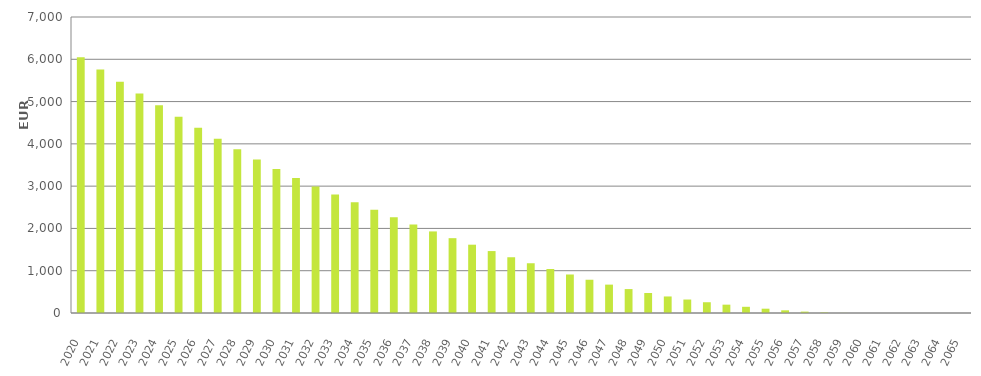
| Category | EUR Millions |
|---|---|
| 2020.0 | 6050000000.14 |
| 2021.0 | 5759240330.973 |
| 2022.0 | 5471656113.495 |
| 2023.0 | 5189148229.569 |
| 2024.0 | 4913283480.805 |
| 2025.0 | 4643263083.084 |
| 2026.0 | 4378808815.453 |
| 2027.0 | 4120387987.99 |
| 2028.0 | 3869697437.512 |
| 2029.0 | 3632024190.563 |
| 2030.0 | 3407168792.943 |
| 2031.0 | 3194025046.026 |
| 2032.0 | 2993133883.009 |
| 2033.0 | 2802756274.414 |
| 2034.0 | 2619739874.723 |
| 2035.0 | 2441683428.668 |
| 2036.0 | 2265683781.916 |
| 2037.0 | 2094617555.398 |
| 2038.0 | 1929173046.017 |
| 2039.0 | 1769485912.931 |
| 2040.0 | 1615380825.714 |
| 2041.0 | 1464580747.138 |
| 2042.0 | 1318465707.36 |
| 2043.0 | 1176577247.936 |
| 2044.0 | 1040714698.966 |
| 2045.0 | 910667752.912 |
| 2046.0 | 786400193.52 |
| 2047.0 | 670953271.614 |
| 2048.0 | 565890804.052 |
| 2049.0 | 472471614.362 |
| 2050.0 | 390908796.505 |
| 2051.0 | 318704961.838 |
| 2052.0 | 254557283.435 |
| 2053.0 | 197185415.162 |
| 2054.0 | 146501602.178 |
| 2055.0 | 101823994.965 |
| 2056.0 | 63461155.096 |
| 2057.0 | 32726405.968 |
| 2058.0 | 12243562.911 |
| 2059.0 | 2245223.966 |
| 2060.0 | 236964.477 |
| 2061.0 | 60884.74 |
| 2062.0 | 18203.488 |
| 2063.0 | 318.403 |
| 2064.0 | 0 |
| 2065.0 | 0 |